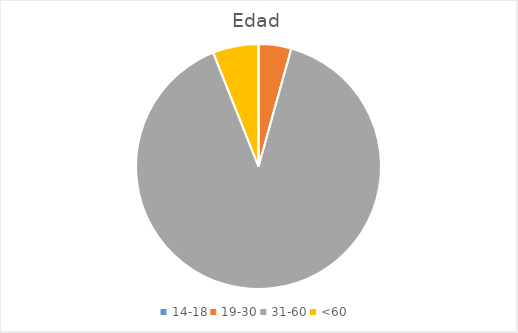
| Category | Series 0 |
|---|---|
| 14-18 | 0 |
| 19-30 | 5 |
| 31-60 | 104 |
| <60 | 7 |